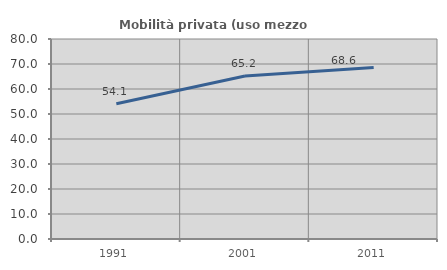
| Category | Mobilità privata (uso mezzo privato) |
|---|---|
| 1991.0 | 54.097 |
| 2001.0 | 65.198 |
| 2011.0 | 68.582 |